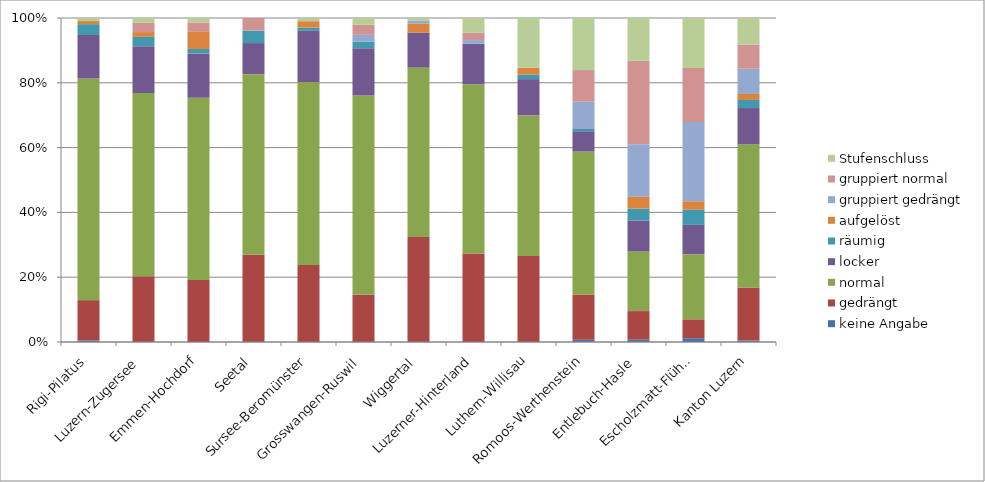
| Category | keine Angabe | gedrängt | normal | locker | räumig | aufgelöst | gruppiert gedrängt | gruppiert normal | Stufenschluss |
|---|---|---|---|---|---|---|---|---|---|
| Rigi-Pilatus | 0.005 | 0.124 | 0.684 | 0.134 | 0.033 | 0.01 | 0 | 0 | 0.01 |
| Luzern-Zugersee | 0 | 0.203 | 0.565 | 0.145 | 0.029 | 0.015 | 0 | 0.029 | 0.015 |
| Emmen-Hochdorf | 0 | 0.191 | 0.561 | 0.137 | 0.014 | 0.055 | 0 | 0.027 | 0.014 |
| Seetal | 0 | 0.27 | 0.558 | 0.096 | 0.039 | 0 | 0 | 0.039 | 0 |
| Sursee-Beromünster | 0 | 0.238 | 0.564 | 0.158 | 0.01 | 0.02 | 0 | 0 | 0.01 |
| Grosswangen-Ruswil | 0 | 0.146 | 0.615 | 0.146 | 0.021 | 0 | 0.021 | 0.031 | 0.021 |
| Wiggertal | 0 | 0.325 | 0.523 | 0.108 | 0 | 0.027 | 0.009 | 0 | 0.009 |
| Luzerner-Hinterland | 0 | 0.273 | 0.523 | 0.125 | 0 | 0 | 0.011 | 0.023 | 0.045 |
| Luthern-Willisau | 0 | 0.266 | 0.434 | 0.112 | 0.014 | 0.021 | 0 | 0 | 0.154 |
| Romoos-Werthenstein | 0.007 | 0.14 | 0.441 | 0.063 | 0.007 | 0 | 0.084 | 0.098 | 0.161 |
| Entlebuch-Hasle | 0.007 | 0.088 | 0.184 | 0.096 | 0.037 | 0.037 | 0.162 | 0.257 | 0.132 |
| Escholzmatt-Flühli | 0.012 | 0.058 | 0.201 | 0.09 | 0.047 | 0.026 | 0.245 | 0.166 | 0.155 |
| Kanton Luzern | 0.004 | 0.164 | 0.442 | 0.112 | 0.025 | 0.019 | 0.078 | 0.075 | 0.082 |